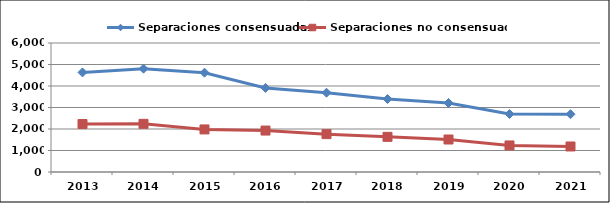
| Category | Separaciones consensuadas | Separaciones no consensuadas |
|---|---|---|
| 2013.0 | 4632 | 2231 |
| 2014.0 | 4805 | 2240 |
| 2015.0 | 4619 | 1980 |
| 2016.0 | 3912 | 1928 |
| 2017.0 | 3687 | 1761 |
| 2018.0 | 3395 | 1635 |
| 2019.0 | 3210 | 1511 |
| 2020.0 | 2697 | 1235 |
| 2021.0 | 2687 | 1187 |